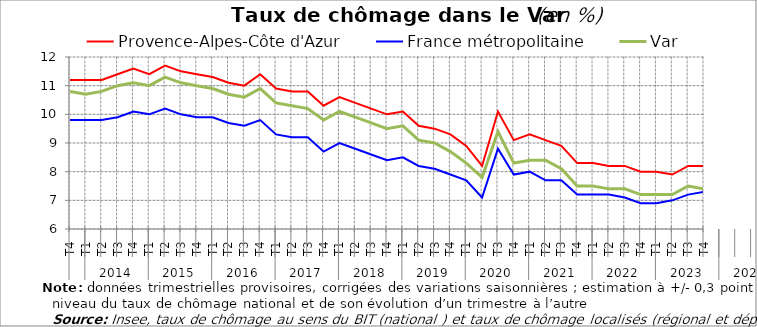
| Category | Provence-Alpes-Côte d'Azur | France métropolitaine | Var |
|---|---|---|---|
| 0 | 11.2 | 9.8 | 10.8 |
| 1 | 11.2 | 9.8 | 10.7 |
| 2 | 11.2 | 9.8 | 10.8 |
| 3 | 11.4 | 9.9 | 11 |
| 4 | 11.6 | 10.1 | 11.1 |
| 5 | 11.4 | 10 | 11 |
| 6 | 11.7 | 10.2 | 11.3 |
| 7 | 11.5 | 10 | 11.1 |
| 8 | 11.4 | 9.9 | 11 |
| 9 | 11.3 | 9.9 | 10.9 |
| 10 | 11.1 | 9.7 | 10.7 |
| 11 | 11 | 9.6 | 10.6 |
| 12 | 11.4 | 9.8 | 10.9 |
| 13 | 10.9 | 9.3 | 10.4 |
| 14 | 10.8 | 9.2 | 10.3 |
| 15 | 10.8 | 9.2 | 10.2 |
| 16 | 10.3 | 8.7 | 9.8 |
| 17 | 10.6 | 9 | 10.1 |
| 18 | 10.4 | 8.8 | 9.9 |
| 19 | 10.2 | 8.6 | 9.7 |
| 20 | 10 | 8.4 | 9.5 |
| 21 | 10.1 | 8.5 | 9.6 |
| 22 | 9.6 | 8.2 | 9.1 |
| 23 | 9.5 | 8.1 | 9 |
| 24 | 9.3 | 7.9 | 8.7 |
| 25 | 8.9 | 7.7 | 8.3 |
| 26 | 8.2 | 7.1 | 7.8 |
| 27 | 10.1 | 8.8 | 9.4 |
| 28 | 9.1 | 7.9 | 8.3 |
| 29 | 9.3 | 8 | 8.4 |
| 30 | 9.1 | 7.7 | 8.4 |
| 31 | 8.9 | 7.7 | 8.1 |
| 32 | 8.3 | 7.2 | 7.5 |
| 33 | 8.3 | 7.2 | 7.5 |
| 34 | 8.2 | 7.2 | 7.4 |
| 35 | 8.2 | 7.1 | 7.4 |
| 36 | 8 | 6.9 | 7.2 |
| 37 | 8 | 6.9 | 7.2 |
| 38 | 7.9 | 7 | 7.2 |
| 39 | 8.2 | 7.2 | 7.5 |
| 40 | 8.2 | 7.3 | 7.4 |